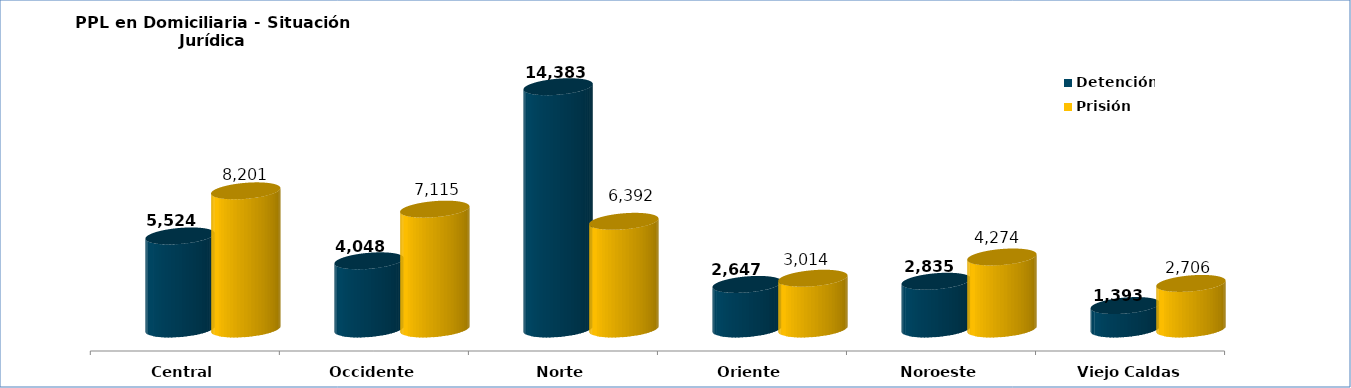
| Category | Detención | Prisión |
|---|---|---|
| Central | 5524 | 8201 |
| Occidente | 4048 | 7115 |
| Norte | 14383 | 6392 |
| Oriente | 2647 | 3014 |
| Noroeste | 2835 | 4274 |
| Viejo Caldas | 1393 | 2706 |